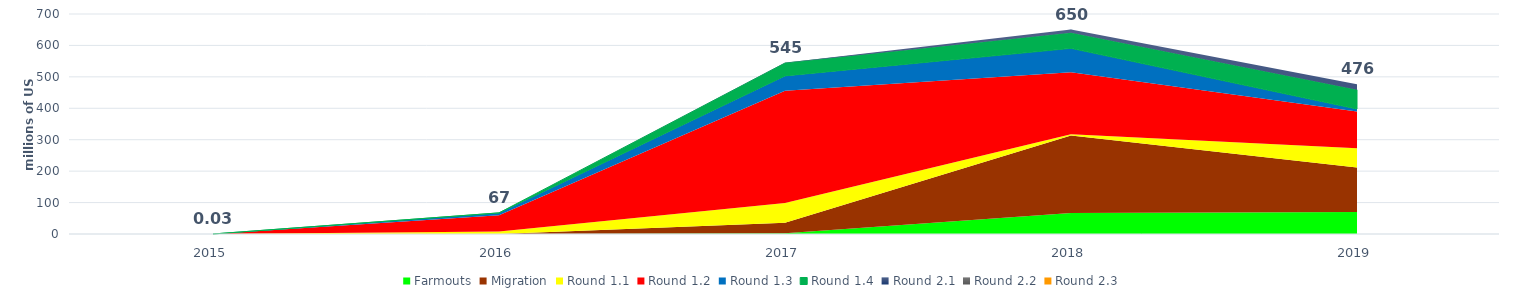
| Category | Series 7 |
|---|---|
| 2015.0 | 0.026 |
| 2016.0 | 67.155 |
| 2017.0 | 544.573 |
| 2018.0 | 650.293 |
| 2019.0 | 476.449 |